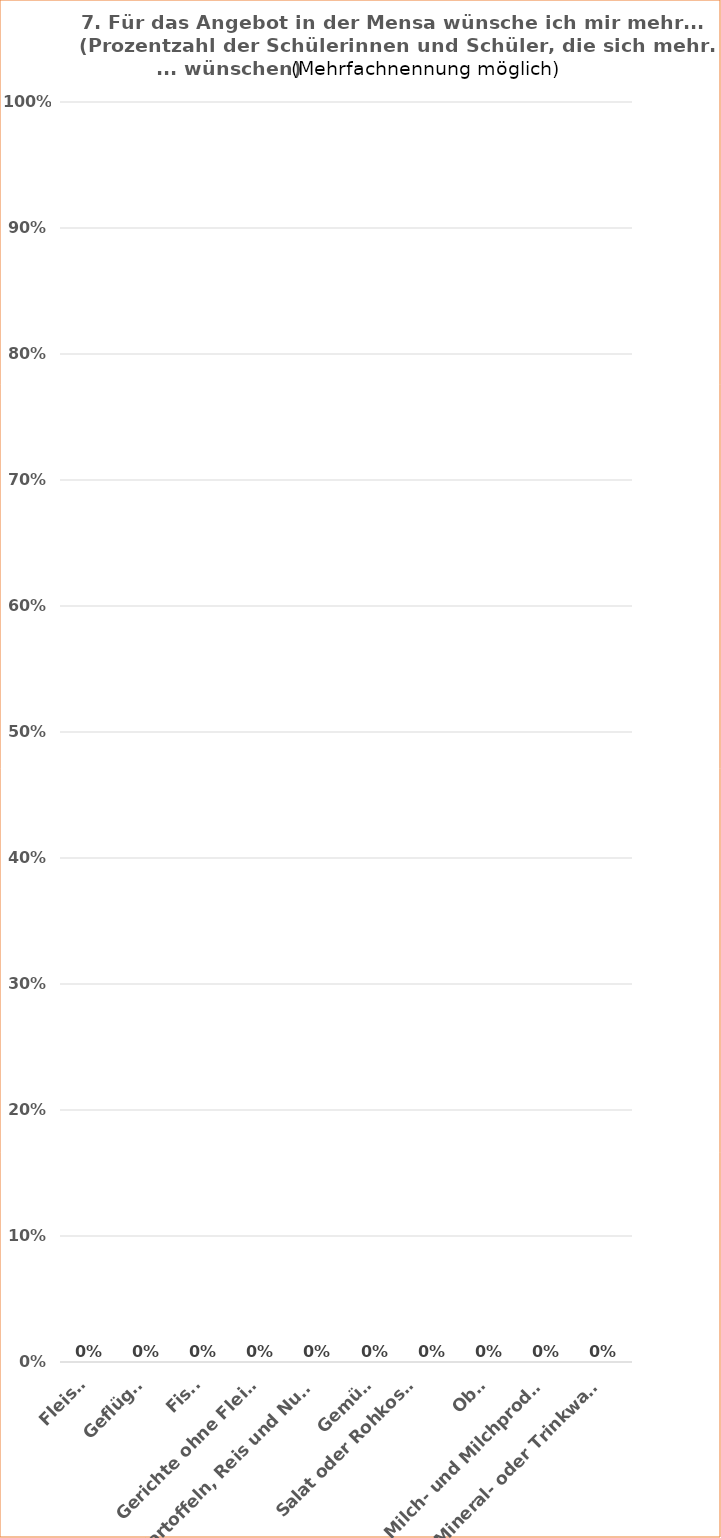
| Category | Series 1 |
|---|---|
| Fleisch | 0 |
| Geflügel | 0 |
| Fisch | 0 |
| Gerichte ohne Fleisch | 0 |
| Kartoffeln, Reis und Nudeln | 0 |
| Gemüse | 0 |
| Salat oder Rohkost
(z. B. Karotten-Sticks) | 0 |
| Obst | 0 |
| Milch- und Milchprodukte | 0 |
| Mineral- oder Trinkwasser | 0 |